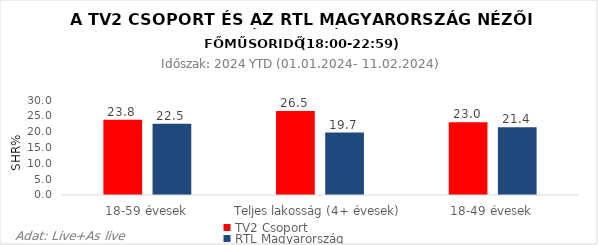
| Category | TV2 Csoport | RTL Magyarország |
|---|---|---|
| 18-59 évesek | 23.8 | 22.5 |
| Teljes lakosság (4+ évesek) | 26.5 | 19.7 |
| 18-49 évesek | 23 | 21.4 |